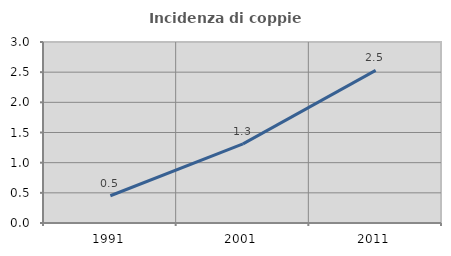
| Category | Incidenza di coppie miste |
|---|---|
| 1991.0 | 0.452 |
| 2001.0 | 1.311 |
| 2011.0 | 2.53 |